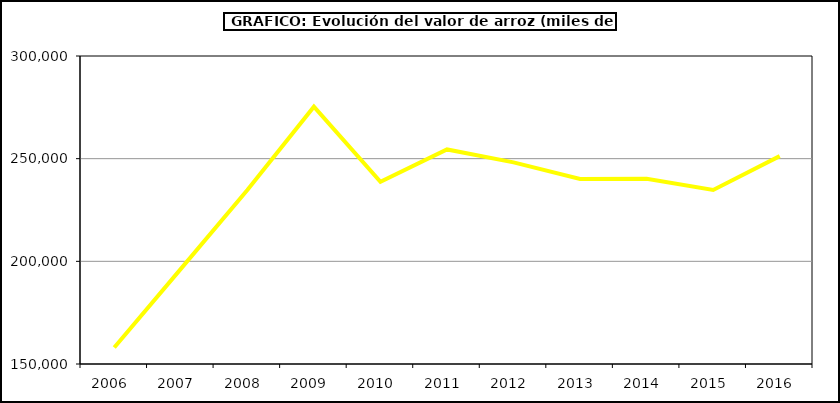
| Category | Valor |
|---|---|
| 2006.0 | 158053.388 |
| 2007.0 | 196337.816 |
| 2008.0 | 234702.005 |
| 2009.0 | 275314.08 |
| 2010.0 | 238727.314 |
| 2011.0 | 254491.862 |
| 2012.0 | 248198.159 |
| 2013.0 | 240076.744 |
| 2014.0 | 240232 |
| 2015.0 | 234720 |
| 2016.0 | 251228 |